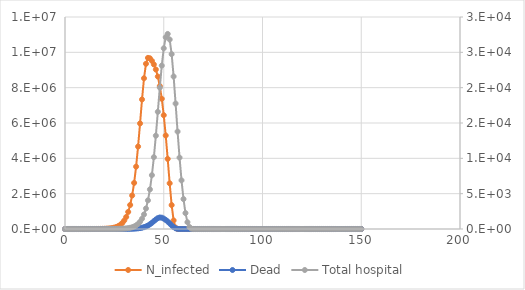
| Category | N_infected |
|---|---|
| 0.0 | 20 |
| 1.0 | 20 |
| 2.0 | 20 |
| 3.0 | 20 |
| 4.0 | 20 |
| 5.0 | 60 |
| 6.0 | 100 |
| 7.0 | 139.995 |
| 8.0 | 179.983 |
| 9.0 | 219.962 |
| 10.0 | 339.931 |
| 11.0 | 539.888 |
| 12.0 | 779.861 |
| 13.0 | 1099.782 |
| 14.0 | 1479.642 |
| 15.0 | 2119.312 |
| 16.0 | 3158.706 |
| 17.0 | 4597.811 |
| 18.0 | 6596.26 |
| 19.0 | 9273.466 |
| 20.0 | 13148.005 |
| 21.0 | 19016.902 |
| 22.0 | 27515.257 |
| 23.0 | 39593.018 |
| 24.0 | 56510.23 |
| 25.0 | 80465.78 |
| 26.0 | 115250.036 |
| 27.0 | 165442.866 |
| 28.0 | 237082.955 |
| 29.0 | 338403.777 |
| 30.0 | 481059.644 |
| 31.0 | 682655.477 |
| 32.0 | 966139.882 |
| 33.0 | 1359534.668 |
| 34.0 | 1895596.293 |
| 35.0 | 2608771.979 |
| 36.0 | 3529600.248 |
| 37.0 | 4666346.053 |
| 38.0 | 5975504.891 |
| 39.0 | 7333539.24 |
| 40.0 | 8533485.473 |
| 41.0 | 9351007.705 |
| 42.0 | 9685102.394 |
| 43.0 | 9662764.797 |
| 44.0 | 9518420.586 |
| 45.0 | 9314592.606 |
| 46.0 | 9028209.151 |
| 47.0 | 8631178.252 |
| 48.0 | 8090411.264 |
| 49.0 | 7370838.592 |
| 50.0 | 6441432.897 |
| 51.0 | 5293045.633 |
| 52.0 | 3967808.699 |
| 53.0 | 2586890.035 |
| 54.0 | 1353174.217 |
| 55.0 | 485977.257 |
| 56.0 | 80015.506 |
| 57.0 | 0 |
| 58.0 | 0 |
| 59.0 | 0 |
| 60.0 | 0 |
| 61.0 | 0 |
| 62.0 | 0 |
| 63.0 | 0 |
| 64.0 | 0 |
| 65.0 | 0 |
| 66.0 | 0 |
| 67.0 | 0 |
| 68.0 | 0 |
| 69.0 | 0 |
| 70.0 | 0 |
| 71.0 | 0 |
| 72.0 | 0 |
| 73.0 | 0 |
| 74.0 | 0 |
| 75.0 | 0 |
| 76.0 | 0 |
| 77.0 | 0 |
| 78.0 | 0 |
| 79.0 | 0 |
| 80.0 | 0 |
| 81.0 | 0 |
| 82.0 | 0 |
| 83.0 | 0 |
| 84.0 | 0 |
| 85.0 | 0 |
| 86.0 | 0 |
| 87.0 | 0 |
| 88.0 | 0 |
| 89.0 | 0 |
| 90.0 | 0 |
| 91.0 | 0 |
| 92.0 | 0 |
| 93.0 | 0 |
| 94.0 | 0 |
| 95.0 | 0 |
| 96.0 | 0 |
| 97.0 | 0 |
| 98.0 | 0 |
| 99.0 | 0 |
| 100.0 | 0 |
| 101.0 | 0 |
| 102.0 | 0 |
| 103.0 | 0 |
| 104.0 | 0 |
| 105.0 | 0 |
| 106.0 | 0 |
| 107.0 | 0 |
| 108.0 | 0 |
| 109.0 | 0 |
| 110.0 | 0 |
| 111.0 | 0 |
| 112.0 | 0 |
| 113.0 | 0 |
| 114.0 | 0 |
| 115.0 | 0 |
| 116.0 | 0 |
| 117.0 | 0 |
| 118.0 | 0 |
| 119.0 | 0 |
| 120.0 | 0 |
| 121.0 | 0 |
| 122.0 | 0 |
| 123.0 | 0 |
| 124.0 | 0 |
| 125.0 | 0 |
| 126.0 | 0 |
| 127.0 | 0 |
| 128.0 | 0 |
| 129.0 | 0 |
| 130.0 | 0 |
| 131.0 | 0 |
| 132.0 | 0 |
| 133.0 | 0 |
| 134.0 | 0 |
| 135.0 | 0 |
| 136.0 | 0 |
| 137.0 | 0 |
| 138.0 | 0 |
| 139.0 | 0 |
| 140.0 | 0 |
| 141.0 | 0 |
| 142.0 | 0 |
| 143.0 | 0 |
| 144.0 | 0 |
| 145.0 | 0 |
| 146.0 | 0 |
| 147.0 | 0 |
| 148.0 | 0 |
| 149.0 | 0 |
| 150.0 | 0 |